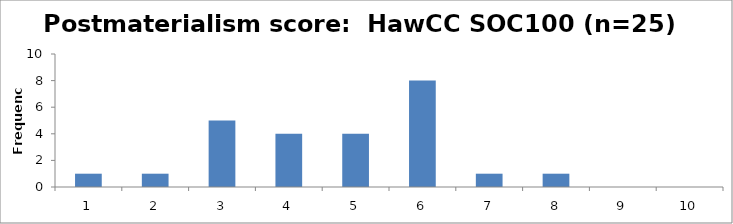
| Category | Frequency |
|---|---|
| 1.0 | 1 |
| 2.0 | 1 |
| 3.0 | 5 |
| 4.0 | 4 |
| 5.0 | 4 |
| 6.0 | 8 |
| 7.0 | 1 |
| 8.0 | 1 |
| 9.0 | 0 |
| 10.0 | 0 |